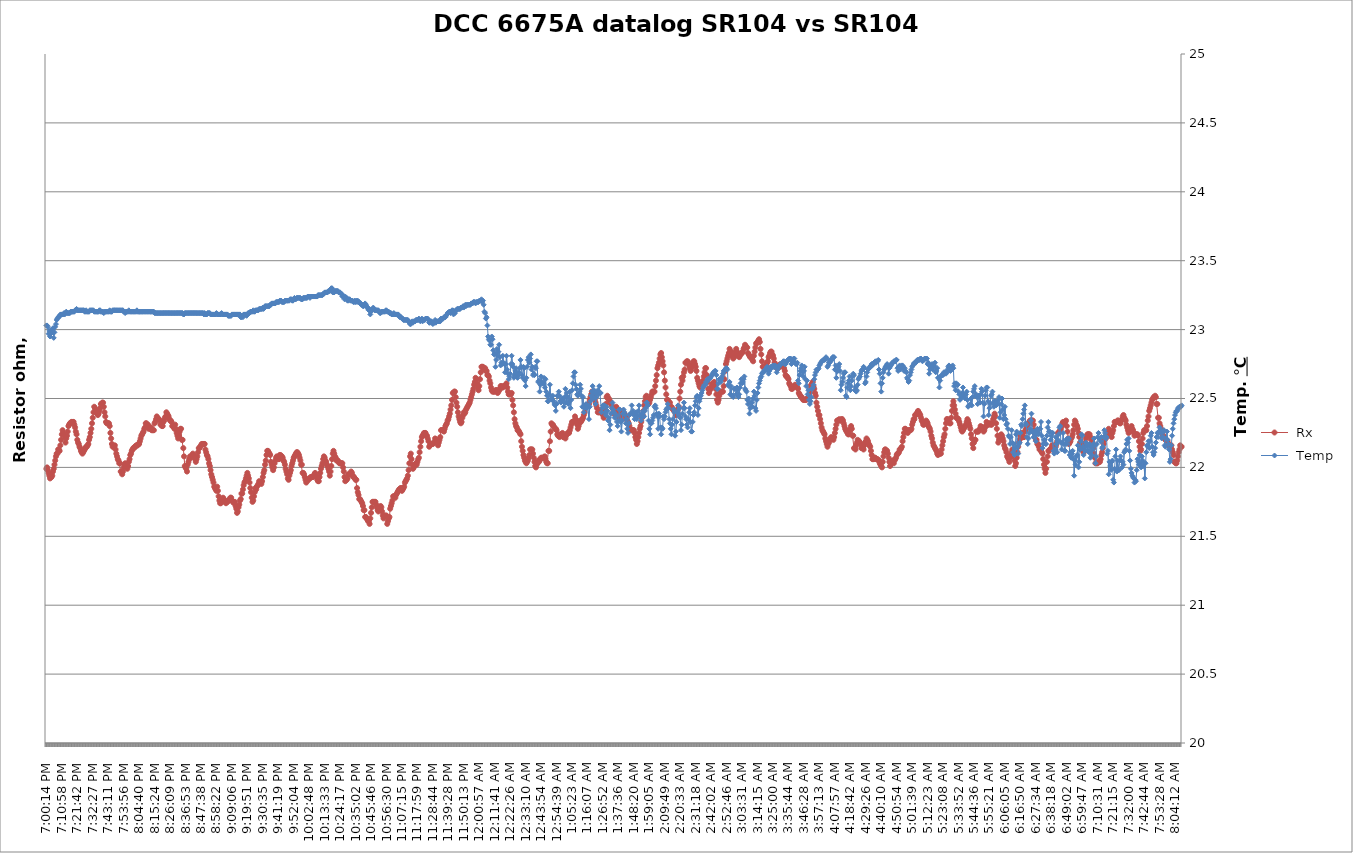
| Category |  Rx |
|---|---|
| 2021-03-25 19:00:14 | 10000.01 |
| 2021-03-25 19:00:44 | 10000.01 |
| 2021-03-25 19:01:15 | 10000.01 |
| 2021-03-25 19:01:46 | 10000.01 |
| 2021-03-25 19:02:16 | 10000.01 |
| 2021-03-25 19:02:47 | 10000.01 |
| 2021-03-25 19:03:18 | 10000.01 |
| 2021-03-25 19:03:49 | 10000.01 |
| 2021-03-25 19:04:19 | 10000.01 |
| 2021-03-25 19:04:50 | 10000.01 |
| 2021-03-25 19:05:21 | 10000.01 |
| 2021-03-25 19:05:51 | 10000.01 |
| 2021-03-25 19:06:22 | 10000.01 |
| 2021-03-25 19:06:53 | 10000.01 |
| 2021-03-25 19:07:23 | 10000.01 |
| 2021-03-25 19:07:54 | 10000.01 |
| 2021-03-25 19:08:25 | 10000.01 |
| 2021-03-25 19:08:55 | 10000.01 |
| 2021-03-25 19:09:26 | 10000.01 |
| 2021-03-25 19:09:57 | 10000.01 |
| 2021-03-25 19:10:27 | 10000.01 |
| 2021-03-25 19:10:58 | 10000.01 |
| 2021-03-25 19:11:29 | 10000.01 |
| 2021-03-25 19:11:59 | 10000.01 |
| 2021-03-25 19:12:30 | 10000.01 |
| 2021-03-25 19:13:01 | 10000.01 |
| 2021-03-25 19:13:32 | 10000.01 |
| 2021-03-25 19:14:02 | 10000.01 |
| 2021-03-25 19:14:33 | 10000.01 |
| 2021-03-25 19:15:04 | 10000.01 |
| 2021-03-25 19:15:34 | 10000.01 |
| 2021-03-25 19:16:05 | 10000.01 |
| 2021-03-25 19:16:36 | 10000.01 |
| 2021-03-25 19:17:06 | 10000.01 |
| 2021-03-25 19:17:37 | 10000.01 |
| 2021-03-25 19:18:08 | 10000.01 |
| 2021-03-25 19:18:38 | 10000.01 |
| 2021-03-25 19:19:09 | 10000.01 |
| 2021-03-25 19:19:40 | 10000.01 |
| 2021-03-25 19:20:10 | 10000.01 |
| 2021-03-25 19:20:41 | 10000.01 |
| 2021-03-25 19:21:12 | 10000.01 |
| 2021-03-25 19:21:42 | 10000.01 |
| 2021-03-25 19:22:13 | 10000.01 |
| 2021-03-25 19:22:44 | 10000.01 |
| 2021-03-25 19:23:15 | 10000.01 |
| 2021-03-25 19:23:45 | 10000.01 |
| 2021-03-25 19:24:16 | 10000.01 |
| 2021-03-25 19:24:47 | 10000.01 |
| 2021-03-25 19:25:17 | 10000.01 |
| 2021-03-25 19:25:48 | 10000.01 |
| 2021-03-25 19:26:19 | 10000.01 |
| 2021-03-25 19:26:49 | 10000.01 |
| 2021-03-25 19:27:20 | 10000.01 |
| 2021-03-25 19:27:51 | 10000.01 |
| 2021-03-25 19:28:21 | 10000.01 |
| 2021-03-25 19:28:52 | 10000.01 |
| 2021-03-25 19:29:23 | 10000.01 |
| 2021-03-25 19:29:53 | 10000.01 |
| 2021-03-25 19:30:24 | 10000.01 |
| 2021-03-25 19:30:55 | 10000.01 |
| 2021-03-25 19:31:25 | 10000.01 |
| 2021-03-25 19:31:56 | 10000.01 |
| 2021-03-25 19:32:27 | 10000.01 |
| 2021-03-25 19:32:58 | 10000.01 |
| 2021-03-25 19:33:28 | 10000.01 |
| 2021-03-25 19:33:59 | 10000.01 |
| 2021-03-25 19:34:30 | 10000.01 |
| 2021-03-25 19:35:00 | 10000.01 |
| 2021-03-25 19:35:31 | 10000.01 |
| 2021-03-25 19:36:02 | 10000.01 |
| 2021-03-25 19:36:32 | 10000.01 |
| 2021-03-25 19:37:03 | 10000.01 |
| 2021-03-25 19:37:34 | 10000.01 |
| 2021-03-25 19:38:04 | 10000.01 |
| 2021-03-25 19:38:35 | 10000.01 |
| 2021-03-25 19:39:06 | 10000.01 |
| 2021-03-25 19:39:36 | 10000.01 |
| 2021-03-25 19:40:07 | 10000.01 |
| 2021-03-25 19:40:38 | 10000.01 |
| 2021-03-25 19:41:09 | 10000.01 |
| 2021-03-25 19:41:39 | 10000.01 |
| 2021-03-25 19:42:10 | 10000.01 |
| 2021-03-25 19:42:41 | 10000.01 |
| 2021-03-25 19:43:11 | 10000.01 |
| 2021-03-25 19:43:42 | 10000.01 |
| 2021-03-25 19:44:13 | 10000.01 |
| 2021-03-25 19:44:43 | 10000.01 |
| 2021-03-25 19:45:14 | 10000.01 |
| 2021-03-25 19:45:45 | 10000.01 |
| 2021-03-25 19:46:15 | 10000.01 |
| 2021-03-25 19:46:46 | 10000.01 |
| 2021-03-25 19:47:17 | 10000.01 |
| 2021-03-25 19:47:47 | 10000.01 |
| 2021-03-25 19:48:18 | 10000.01 |
| 2021-03-25 19:48:49 | 10000.01 |
| 2021-03-25 19:49:19 | 10000.01 |
| 2021-03-25 19:49:50 | 10000.01 |
| 2021-03-25 19:50:21 | 10000.01 |
| 2021-03-25 19:50:52 | 10000.01 |
| 2021-03-25 19:51:22 | 10000.01 |
| 2021-03-25 19:51:53 | 10000.01 |
| 2021-03-25 19:52:24 | 10000.01 |
| 2021-03-25 19:52:54 | 10000.01 |
| 2021-03-25 19:53:25 | 10000.01 |
| 2021-03-25 19:53:56 | 10000.01 |
| 2021-03-25 19:54:26 | 10000.01 |
| 2021-03-25 19:54:57 | 10000.01 |
| 2021-03-25 19:55:28 | 10000.01 |
| 2021-03-25 19:55:58 | 10000.01 |
| 2021-03-25 19:56:29 | 10000.01 |
| 2021-03-25 19:57:00 | 10000.01 |
| 2021-03-25 19:57:30 | 10000.01 |
| 2021-03-25 19:58:01 | 10000.01 |
| 2021-03-25 19:58:32 | 10000.01 |
| 2021-03-25 19:59:03 | 10000.01 |
| 2021-03-25 19:59:33 | 10000.01 |
| 2021-03-25 20:00:04 | 10000.01 |
| 2021-03-25 20:00:35 | 10000.01 |
| 2021-03-25 20:01:05 | 10000.01 |
| 2021-03-25 20:01:36 | 10000.01 |
| 2021-03-25 20:02:07 | 10000.01 |
| 2021-03-25 20:02:37 | 10000.01 |
| 2021-03-25 20:03:08 | 10000.01 |
| 2021-03-25 20:03:39 | 10000.01 |
| 2021-03-25 20:04:09 | 10000.01 |
| 2021-03-25 20:04:40 | 10000.01 |
| 2021-03-25 20:05:11 | 10000.01 |
| 2021-03-25 20:05:41 | 10000.01 |
| 2021-03-25 20:06:12 | 10000.01 |
| 2021-03-25 20:06:43 | 10000.01 |
| 2021-03-25 20:07:13 | 10000.01 |
| 2021-03-25 20:07:44 | 10000.01 |
| 2021-03-25 20:08:15 | 10000.01 |
| 2021-03-25 20:08:46 | 10000.01 |
| 2021-03-25 20:09:16 | 10000.01 |
| 2021-03-25 20:09:47 | 10000.01 |
| 2021-03-25 20:10:18 | 10000.01 |
| 2021-03-25 20:10:48 | 10000.01 |
| 2021-03-25 20:11:19 | 10000.01 |
| 2021-03-25 20:11:50 | 10000.01 |
| 2021-03-25 20:12:20 | 10000.01 |
| 2021-03-25 20:12:51 | 10000.01 |
| 2021-03-25 20:13:22 | 10000.01 |
| 2021-03-25 20:13:52 | 10000.01 |
| 2021-03-25 20:14:23 | 10000.01 |
| 2021-03-25 20:14:54 | 10000.01 |
| 2021-03-25 20:15:24 | 10000.01 |
| 2021-03-25 20:15:55 | 10000.01 |
| 2021-03-25 20:16:26 | 10000.01 |
| 2021-03-25 20:16:56 | 10000.01 |
| 2021-03-25 20:17:27 | 10000.01 |
| 2021-03-25 20:17:58 | 10000.01 |
| 2021-03-25 20:18:29 | 10000.01 |
| 2021-03-25 20:18:59 | 10000.01 |
| 2021-03-25 20:19:30 | 10000.01 |
| 2021-03-25 20:20:01 | 10000.01 |
| 2021-03-25 20:20:31 | 10000.01 |
| 2021-03-25 20:21:02 | 10000.01 |
| 2021-03-25 20:21:33 | 10000.01 |
| 2021-03-25 20:22:03 | 10000.01 |
| 2021-03-25 20:22:34 | 10000.01 |
| 2021-03-25 20:23:05 | 10000.01 |
| 2021-03-25 20:23:35 | 10000.01 |
| 2021-03-25 20:24:06 | 10000.01 |
| 2021-03-25 20:24:37 | 10000.01 |
| 2021-03-25 20:25:07 | 10000.01 |
| 2021-03-25 20:25:38 | 10000.01 |
| 2021-03-25 20:26:09 | 10000.01 |
| 2021-03-25 20:26:40 | 10000.01 |
| 2021-03-25 20:27:10 | 10000.01 |
| 2021-03-25 20:27:41 | 10000.01 |
| 2021-03-25 20:28:12 | 10000.01 |
| 2021-03-25 20:28:42 | 10000.01 |
| 2021-03-25 20:29:13 | 10000.01 |
| 2021-03-25 20:29:44 | 10000.01 |
| 2021-03-25 20:30:14 | 10000.01 |
| 2021-03-25 20:30:45 | 10000.01 |
| 2021-03-25 20:31:16 | 10000.01 |
| 2021-03-25 20:31:46 | 10000.01 |
| 2021-03-25 20:32:17 | 10000.01 |
| 2021-03-25 20:32:48 | 10000.01 |
| 2021-03-25 20:33:18 | 10000.01 |
| 2021-03-25 20:33:49 | 10000.01 |
| 2021-03-25 20:34:20 | 10000.01 |
| 2021-03-25 20:34:50 | 10000.01 |
| 2021-03-25 20:35:21 | 10000.01 |
| 2021-03-25 20:35:52 | 10000.01 |
| 2021-03-25 20:36:23 | 10000.01 |
| 2021-03-25 20:36:53 | 10000.01 |
| 2021-03-25 20:37:24 | 10000.01 |
| 2021-03-25 20:37:55 | 10000.01 |
| 2021-03-25 20:38:25 | 10000.01 |
| 2021-03-25 20:38:56 | 10000.01 |
| 2021-03-25 20:39:27 | 10000.01 |
| 2021-03-25 20:39:57 | 10000.01 |
| 2021-03-25 20:40:28 | 10000.01 |
| 2021-03-25 20:40:59 | 10000.01 |
| 2021-03-25 20:41:29 | 10000.01 |
| 2021-03-25 20:42:00 | 10000.01 |
| 2021-03-25 20:42:31 | 10000.01 |
| 2021-03-25 20:43:01 | 10000.01 |
| 2021-03-25 20:43:32 | 10000.01 |
| 2021-03-25 20:44:03 | 10000.01 |
| 2021-03-25 20:44:33 | 10000.01 |
| 2021-03-25 20:45:04 | 10000.01 |
| 2021-03-25 20:45:35 | 10000.01 |
| 2021-03-25 20:46:06 | 10000.01 |
| 2021-03-25 20:46:36 | 10000.01 |
| 2021-03-25 20:47:07 | 10000.01 |
| 2021-03-25 20:47:38 | 10000.01 |
| 2021-03-25 20:48:08 | 10000.01 |
| 2021-03-25 20:48:39 | 10000.01 |
| 2021-03-25 20:49:10 | 10000.01 |
| 2021-03-25 20:49:40 | 10000.01 |
| 2021-03-25 20:50:11 | 10000.01 |
| 2021-03-25 20:50:42 | 10000.01 |
| 2021-03-25 20:51:12 | 10000.01 |
| 2021-03-25 20:51:43 | 10000.01 |
| 2021-03-25 20:52:14 | 10000.01 |
| 2021-03-25 20:52:44 | 10000.01 |
| 2021-03-25 20:53:15 | 10000.01 |
| 2021-03-25 20:53:46 | 10000.01 |
| 2021-03-25 20:54:17 | 10000.01 |
| 2021-03-25 20:54:47 | 10000.01 |
| 2021-03-25 20:55:18 | 10000.01 |
| 2021-03-25 20:55:49 | 10000.01 |
| 2021-03-25 20:56:19 | 10000.01 |
| 2021-03-25 20:56:50 | 10000.01 |
| 2021-03-25 20:57:21 | 10000.01 |
| 2021-03-25 20:57:51 | 10000.01 |
| 2021-03-25 20:58:22 | 10000.01 |
| 2021-03-25 20:58:53 | 10000.01 |
| 2021-03-25 20:59:23 | 10000.01 |
| 2021-03-25 20:59:54 | 10000.01 |
| 2021-03-25 21:00:25 | 10000.01 |
| 2021-03-25 21:00:55 | 10000.01 |
| 2021-03-25 21:01:26 | 10000.01 |
| 2021-03-25 21:01:57 | 10000.01 |
| 2021-03-25 21:02:27 | 10000.01 |
| 2021-03-25 21:02:58 | 10000.01 |
| 2021-03-25 21:03:29 | 10000.01 |
| 2021-03-25 21:03:59 | 10000.01 |
| 2021-03-25 21:04:30 | 10000.01 |
| 2021-03-25 21:05:01 | 10000.01 |
| 2021-03-25 21:05:32 | 10000.01 |
| 2021-03-25 21:06:02 | 10000.01 |
| 2021-03-25 21:06:33 | 10000.01 |
| 2021-03-25 21:07:04 | 10000.01 |
| 2021-03-25 21:07:34 | 10000.01 |
| 2021-03-25 21:08:05 | 10000.01 |
| 2021-03-25 21:08:36 | 10000.01 |
| 2021-03-25 21:09:06 | 10000.01 |
| 2021-03-25 21:09:37 | 10000.01 |
| 2021-03-25 21:10:08 | 10000.01 |
| 2021-03-25 21:10:38 | 10000.01 |
| 2021-03-25 21:11:09 | 10000.01 |
| 2021-03-25 21:11:40 | 10000.01 |
| 2021-03-25 21:12:10 | 10000.01 |
| 2021-03-25 21:12:41 | 10000.01 |
| 2021-03-25 21:13:12 | 10000.01 |
| 2021-03-25 21:13:42 | 10000.01 |
| 2021-03-25 21:14:13 | 10000.01 |
| 2021-03-25 21:14:44 | 10000.01 |
| 2021-03-25 21:15:15 | 10000.01 |
| 2021-03-25 21:15:45 | 10000.01 |
| 2021-03-25 21:16:16 | 10000.01 |
| 2021-03-25 21:16:47 | 10000.01 |
| 2021-03-25 21:17:17 | 10000.01 |
| 2021-03-25 21:17:48 | 10000.01 |
| 2021-03-25 21:18:19 | 10000.01 |
| 2021-03-25 21:18:49 | 10000.01 |
| 2021-03-25 21:19:20 | 10000.01 |
| 2021-03-25 21:19:51 | 10000.01 |
| 2021-03-25 21:20:21 | 10000.01 |
| 2021-03-25 21:20:52 | 10000.01 |
| 2021-03-25 21:21:23 | 10000.01 |
| 2021-03-25 21:21:53 | 10000.01 |
| 2021-03-25 21:22:24 | 10000.01 |
| 2021-03-25 21:22:55 | 10000.01 |
| 2021-03-25 21:23:25 | 10000.01 |
| 2021-03-25 21:23:56 | 10000.01 |
| 2021-03-25 21:24:27 | 10000.01 |
| 2021-03-25 21:24:58 | 10000.01 |
| 2021-03-25 21:25:28 | 10000.01 |
| 2021-03-25 21:25:59 | 10000.01 |
| 2021-03-25 21:26:30 | 10000.01 |
| 2021-03-25 21:27:00 | 10000.01 |
| 2021-03-25 21:27:31 | 10000.01 |
| 2021-03-25 21:28:02 | 10000.01 |
| 2021-03-25 21:28:32 | 10000.01 |
| 2021-03-25 21:29:03 | 10000.01 |
| 2021-03-25 21:29:34 | 10000.01 |
| 2021-03-25 21:30:04 | 10000.01 |
| 2021-03-25 21:30:35 | 10000.01 |
| 2021-03-25 21:31:06 | 10000.01 |
| 2021-03-25 21:31:36 | 10000.01 |
| 2021-03-25 21:32:07 | 10000.01 |
| 2021-03-25 21:32:38 | 10000.01 |
| 2021-03-25 21:33:08 | 10000.01 |
| 2021-03-25 21:33:39 | 10000.01 |
| 2021-03-25 21:34:10 | 10000.01 |
| 2021-03-25 21:34:41 | 10000.01 |
| 2021-03-25 21:35:11 | 10000.01 |
| 2021-03-25 21:35:42 | 10000.01 |
| 2021-03-25 21:36:13 | 10000.01 |
| 2021-03-25 21:36:43 | 10000.01 |
| 2021-03-25 21:37:14 | 10000.01 |
| 2021-03-25 21:37:45 | 10000.01 |
| 2021-03-25 21:38:15 | 10000.01 |
| 2021-03-25 21:38:46 | 10000.01 |
| 2021-03-25 21:39:17 | 10000.01 |
| 2021-03-25 21:39:47 | 10000.01 |
| 2021-03-25 21:40:18 | 10000.01 |
| 2021-03-25 21:40:49 | 10000.01 |
| 2021-03-25 21:41:19 | 10000.01 |
| 2021-03-25 21:41:50 | 10000.01 |
| 2021-03-25 21:42:21 | 10000.01 |
| 2021-03-25 21:42:51 | 10000.01 |
| 2021-03-25 21:43:22 | 10000.01 |
| 2021-03-25 21:43:53 | 10000.01 |
| 2021-03-25 21:44:24 | 10000.01 |
| 2021-03-25 21:44:54 | 10000.01 |
| 2021-03-25 21:45:25 | 10000.01 |
| 2021-03-25 21:45:56 | 10000.01 |
| 2021-03-25 21:46:26 | 10000.01 |
| 2021-03-25 21:46:57 | 10000.01 |
| 2021-03-25 21:47:28 | 10000.01 |
| 2021-03-25 21:47:58 | 10000.01 |
| 2021-03-25 21:48:29 | 10000.01 |
| 2021-03-25 21:49:00 | 10000.01 |
| 2021-03-25 21:49:30 | 10000.01 |
| 2021-03-25 21:50:01 | 10000.01 |
| 2021-03-25 21:50:32 | 10000.01 |
| 2021-03-25 21:51:02 | 10000.01 |
| 2021-03-25 21:51:33 | 10000.01 |
| 2021-03-25 21:52:04 | 10000.01 |
| 2021-03-25 21:52:35 | 10000.01 |
| 2021-03-25 21:53:05 | 10000.01 |
| 2021-03-25 21:53:36 | 10000.01 |
| 2021-03-25 21:54:07 | 10000.01 |
| 2021-03-25 21:54:37 | 10000.01 |
| 2021-03-25 21:55:08 | 10000.01 |
| 2021-03-25 21:55:39 | 10000.01 |
| 2021-03-25 21:56:09 | 10000.01 |
| 2021-03-25 21:56:40 | 10000.01 |
| 2021-03-25 21:57:11 | 10000.01 |
| 2021-03-25 21:57:41 | 10000.01 |
| 2021-03-25 21:58:12 | 10000.01 |
| 2021-03-25 21:58:43 | 10000.01 |
| 2021-03-25 21:59:13 | 10000.01 |
| 2021-03-25 21:59:44 | 10000.01 |
| 2021-03-25 22:00:15 | 10000.01 |
| 2021-03-25 22:00:46 | 10000.01 |
| 2021-03-25 22:01:16 | 10000.01 |
| 2021-03-25 22:01:47 | 10000.01 |
| 2021-03-25 22:02:18 | 10000.01 |
| 2021-03-25 22:02:48 | 10000.01 |
| 2021-03-25 22:03:19 | 10000.01 |
| 2021-03-25 22:03:50 | 10000.01 |
| 2021-03-25 22:04:20 | 10000.01 |
| 2021-03-25 22:04:51 | 10000.01 |
| 2021-03-25 22:05:22 | 10000.01 |
| 2021-03-25 22:05:52 | 10000.01 |
| 2021-03-25 22:06:23 | 10000.01 |
| 2021-03-25 22:06:54 | 10000.01 |
| 2021-03-25 22:07:24 | 10000.01 |
| 2021-03-25 22:07:55 | 10000.01 |
| 2021-03-25 22:08:26 | 10000.01 |
| 2021-03-25 22:08:56 | 10000.01 |
| 2021-03-25 22:09:27 | 10000.01 |
| 2021-03-25 22:09:58 | 10000.01 |
| 2021-03-25 22:10:29 | 10000.01 |
| 2021-03-25 22:10:59 | 10000.01 |
| 2021-03-25 22:11:30 | 10000.01 |
| 2021-03-25 22:12:01 | 10000.01 |
| 2021-03-25 22:12:31 | 10000.01 |
| 2021-03-25 22:13:02 | 10000.01 |
| 2021-03-25 22:13:33 | 10000.01 |
| 2021-03-25 22:14:03 | 10000.01 |
| 2021-03-25 22:14:34 | 10000.01 |
| 2021-03-25 22:15:05 | 10000.01 |
| 2021-03-25 22:15:35 | 10000.01 |
| 2021-03-25 22:16:06 | 10000.01 |
| 2021-03-25 22:16:37 | 10000.01 |
| 2021-03-25 22:17:07 | 10000.01 |
| 2021-03-25 22:17:38 | 10000.01 |
| 2021-03-25 22:18:09 | 10000.01 |
| 2021-03-25 22:18:40 | 10000.01 |
| 2021-03-25 22:19:10 | 10000.01 |
| 2021-03-25 22:19:41 | 10000.01 |
| 2021-03-25 22:20:12 | 10000.01 |
| 2021-03-25 22:20:42 | 10000.01 |
| 2021-03-25 22:21:13 | 10000.01 |
| 2021-03-25 22:21:44 | 10000.01 |
| 2021-03-25 22:22:14 | 10000.01 |
| 2021-03-25 22:22:45 | 10000.01 |
| 2021-03-25 22:23:16 | 10000.01 |
| 2021-03-25 22:23:46 | 10000.01 |
| 2021-03-25 22:24:17 | 10000.01 |
| 2021-03-25 22:24:48 | 10000.01 |
| 2021-03-25 22:25:18 | 10000.01 |
| 2021-03-25 22:25:49 | 10000.01 |
| 2021-03-25 22:26:20 | 10000.01 |
| 2021-03-25 22:26:51 | 10000.01 |
| 2021-03-25 22:27:21 | 10000.01 |
| 2021-03-25 22:27:52 | 10000.01 |
| 2021-03-25 22:28:23 | 10000.01 |
| 2021-03-25 22:28:53 | 10000.01 |
| 2021-03-25 22:29:24 | 10000.01 |
| 2021-03-25 22:29:55 | 10000.01 |
| 2021-03-25 22:30:25 | 10000.01 |
| 2021-03-25 22:30:56 | 10000.01 |
| 2021-03-25 22:31:27 | 10000.01 |
| 2021-03-25 22:31:57 | 10000.01 |
| 2021-03-25 22:32:28 | 10000.01 |
| 2021-03-25 22:32:59 | 10000.01 |
| 2021-03-25 22:33:29 | 10000.01 |
| 2021-03-25 22:34:00 | 10000.01 |
| 2021-03-25 22:34:31 | 10000.01 |
| 2021-03-25 22:35:02 | 10000.01 |
| 2021-03-25 22:35:32 | 10000.01 |
| 2021-03-25 22:36:03 | 10000.01 |
| 2021-03-25 22:36:34 | 10000.01 |
| 2021-03-25 22:37:04 | 10000.01 |
| 2021-03-25 22:37:35 | 10000.01 |
| 2021-03-25 22:38:06 | 10000.01 |
| 2021-03-25 22:38:36 | 10000.01 |
| 2021-03-25 22:39:07 | 10000.01 |
| 2021-03-25 22:39:38 | 10000.01 |
| 2021-03-25 22:40:08 | 10000.01 |
| 2021-03-25 22:40:39 | 10000.01 |
| 2021-03-25 22:41:10 | 10000.01 |
| 2021-03-25 22:41:40 | 10000.01 |
| 2021-03-25 22:42:11 | 10000.01 |
| 2021-03-25 22:42:42 | 10000.01 |
| 2021-03-25 22:43:13 | 10000.01 |
| 2021-03-25 22:43:43 | 10000.01 |
| 2021-03-25 22:44:14 | 10000.01 |
| 2021-03-25 22:44:45 | 10000.01 |
| 2021-03-25 22:45:15 | 10000.01 |
| 2021-03-25 22:45:46 | 10000.01 |
| 2021-03-25 22:46:17 | 10000.01 |
| 2021-03-25 22:46:47 | 10000.01 |
| 2021-03-25 22:47:18 | 10000.01 |
| 2021-03-25 22:47:49 | 10000.01 |
| 2021-03-25 22:48:19 | 10000.01 |
| 2021-03-25 22:48:50 | 10000.01 |
| 2021-03-25 22:49:21 | 10000.01 |
| 2021-03-25 22:49:51 | 10000.01 |
| 2021-03-25 22:50:22 | 10000.01 |
| 2021-03-25 22:50:53 | 10000.01 |
| 2021-03-25 22:51:24 | 10000.01 |
| 2021-03-25 22:51:54 | 10000.01 |
| 2021-03-25 22:52:25 | 10000.01 |
| 2021-03-25 22:52:56 | 10000.01 |
| 2021-03-25 22:53:26 | 10000.01 |
| 2021-03-25 22:53:57 | 10000.01 |
| 2021-03-25 22:54:28 | 10000.01 |
| 2021-03-25 22:54:58 | 10000.01 |
| 2021-03-25 22:55:29 | 10000.01 |
| 2021-03-25 22:56:00 | 10000.01 |
| 2021-03-25 22:56:30 | 10000.01 |
| 2021-03-25 22:57:01 | 10000.01 |
| 2021-03-25 22:57:32 | 10000.01 |
| 2021-03-25 22:58:02 | 10000.01 |
| 2021-03-25 22:58:33 | 10000.01 |
| 2021-03-25 22:59:04 | 10000.01 |
| 2021-03-25 22:59:34 | 10000.01 |
| 2021-03-25 23:00:05 | 10000.01 |
| 2021-03-25 23:00:36 | 10000.01 |
| 2021-03-25 23:01:07 | 10000.01 |
| 2021-03-25 23:01:37 | 10000.01 |
| 2021-03-25 23:02:08 | 10000.01 |
| 2021-03-25 23:02:39 | 10000.01 |
| 2021-03-25 23:03:09 | 10000.01 |
| 2021-03-25 23:03:40 | 10000.01 |
| 2021-03-25 23:04:11 | 10000.01 |
| 2021-03-25 23:04:41 | 10000.01 |
| 2021-03-25 23:05:12 | 10000.01 |
| 2021-03-25 23:05:43 | 10000.01 |
| 2021-03-25 23:06:13 | 10000.01 |
| 2021-03-25 23:06:44 | 10000.01 |
| 2021-03-25 23:07:15 | 10000.01 |
| 2021-03-25 23:07:46 | 10000.01 |
| 2021-03-25 23:08:16 | 10000.01 |
| 2021-03-25 23:08:47 | 10000.01 |
| 2021-03-25 23:09:18 | 10000.01 |
| 2021-03-25 23:09:48 | 10000.01 |
| 2021-03-25 23:10:19 | 10000.01 |
| 2021-03-25 23:10:50 | 10000.01 |
| 2021-03-25 23:11:20 | 10000.01 |
| 2021-03-25 23:11:51 | 10000.01 |
| 2021-03-25 23:12:22 | 10000.01 |
| 2021-03-25 23:12:52 | 10000.01 |
| 2021-03-25 23:13:23 | 10000.01 |
| 2021-03-25 23:13:54 | 10000.01 |
| 2021-03-25 23:14:24 | 10000.01 |
| 2021-03-25 23:14:55 | 10000.01 |
| 2021-03-25 23:15:26 | 10000.01 |
| 2021-03-25 23:15:57 | 10000.01 |
| 2021-03-25 23:16:27 | 10000.01 |
| 2021-03-25 23:16:58 | 10000.01 |
| 2021-03-25 23:17:29 | 10000.01 |
| 2021-03-25 23:17:59 | 10000.01 |
| 2021-03-25 23:18:30 | 10000.01 |
| 2021-03-25 23:19:01 | 10000.01 |
| 2021-03-25 23:19:31 | 10000.01 |
| 2021-03-25 23:20:02 | 10000.01 |
| 2021-03-25 23:20:33 | 10000.01 |
| 2021-03-25 23:21:03 | 10000.01 |
| 2021-03-25 23:21:34 | 10000.01 |
| 2021-03-25 23:22:05 | 10000.01 |
| 2021-03-25 23:22:35 | 10000.01 |
| 2021-03-25 23:23:06 | 10000.01 |
| 2021-03-25 23:23:37 | 10000.01 |
| 2021-03-25 23:24:08 | 10000.01 |
| 2021-03-25 23:24:38 | 10000.01 |
| 2021-03-25 23:25:09 | 10000.01 |
| 2021-03-25 23:25:40 | 10000.01 |
| 2021-03-25 23:26:10 | 10000.01 |
| 2021-03-25 23:26:41 | 10000.01 |
| 2021-03-25 23:27:12 | 10000.01 |
| 2021-03-25 23:27:42 | 10000.01 |
| 2021-03-25 23:28:13 | 10000.01 |
| 2021-03-25 23:28:44 | 10000.01 |
| 2021-03-25 23:29:14 | 10000.01 |
| 2021-03-25 23:29:45 | 10000.01 |
| 2021-03-25 23:30:16 | 10000.01 |
| 2021-03-25 23:30:46 | 10000.01 |
| 2021-03-25 23:31:17 | 10000.01 |
| 2021-03-25 23:31:48 | 10000.01 |
| 2021-03-25 23:32:19 | 10000.01 |
| 2021-03-25 23:32:49 | 10000.01 |
| 2021-03-25 23:33:20 | 10000.01 |
| 2021-03-25 23:33:51 | 10000.01 |
| 2021-03-25 23:34:21 | 10000.01 |
| 2021-03-25 23:34:52 | 10000.01 |
| 2021-03-25 23:35:23 | 10000.01 |
| 2021-03-25 23:35:53 | 10000.01 |
| 2021-03-25 23:36:24 | 10000.01 |
| 2021-03-25 23:36:55 | 10000.01 |
| 2021-03-25 23:37:25 | 10000.01 |
| 2021-03-25 23:37:56 | 10000.01 |
| 2021-03-25 23:38:27 | 10000.01 |
| 2021-03-25 23:38:57 | 10000.01 |
| 2021-03-25 23:39:28 | 10000.01 |
| 2021-03-25 23:39:59 | 10000.01 |
| 2021-03-25 23:40:29 | 10000.01 |
| 2021-03-25 23:41:00 | 10000.01 |
| 2021-03-25 23:41:31 | 10000.01 |
| 2021-03-25 23:42:02 | 10000.01 |
| 2021-03-25 23:42:32 | 10000.011 |
| 2021-03-25 23:43:03 | 10000.011 |
| 2021-03-25 23:43:34 | 10000.011 |
| 2021-03-25 23:44:04 | 10000.011 |
| 2021-03-25 23:44:35 | 10000.011 |
| 2021-03-25 23:45:06 | 10000.01 |
| 2021-03-25 23:45:36 | 10000.01 |
| 2021-03-25 23:46:07 | 10000.01 |
| 2021-03-25 23:46:38 | 10000.01 |
| 2021-03-25 23:47:08 | 10000.01 |
| 2021-03-25 23:47:39 | 10000.01 |
| 2021-03-25 23:48:10 | 10000.01 |
| 2021-03-25 23:48:40 | 10000.01 |
| 2021-03-25 23:49:11 | 10000.01 |
| 2021-03-25 23:49:42 | 10000.01 |
| 2021-03-25 23:50:13 | 10000.01 |
| 2021-03-25 23:50:43 | 10000.01 |
| 2021-03-25 23:51:14 | 10000.01 |
| 2021-03-25 23:51:45 | 10000.01 |
| 2021-03-25 23:52:15 | 10000.01 |
| 2021-03-25 23:52:46 | 10000.01 |
| 2021-03-25 23:53:17 | 10000.01 |
| 2021-03-25 23:53:47 | 10000.01 |
| 2021-03-25 23:54:18 | 10000.01 |
| 2021-03-25 23:54:49 | 10000.01 |
| 2021-03-25 23:55:19 | 10000.011 |
| 2021-03-25 23:55:50 | 10000.011 |
| 2021-03-25 23:56:21 | 10000.011 |
| 2021-03-25 23:56:51 | 10000.011 |
| 2021-03-25 23:57:22 | 10000.011 |
| 2021-03-25 23:57:53 | 10000.011 |
| 2021-03-25 23:58:24 | 10000.011 |
| 2021-03-25 23:58:54 | 10000.011 |
| 2021-03-25 23:59:25 | 10000.011 |
| 2021-03-25 23:59:56 | 10000.011 |
| 2021-03-26 00:00:26 | 10000.011 |
| 2021-03-26 00:00:57 | 10000.011 |
| 2021-03-26 00:01:28 | 10000.011 |
| 2021-03-26 00:01:58 | 10000.011 |
| 2021-03-26 00:02:29 | 10000.011 |
| 2021-03-26 00:03:00 | 10000.011 |
| 2021-03-26 00:03:30 | 10000.011 |
| 2021-03-26 00:04:01 | 10000.011 |
| 2021-03-26 00:04:32 | 10000.011 |
| 2021-03-26 00:05:02 | 10000.011 |
| 2021-03-26 00:05:33 | 10000.011 |
| 2021-03-26 00:06:04 | 10000.011 |
| 2021-03-26 00:06:35 | 10000.011 |
| 2021-03-26 00:07:05 | 10000.011 |
| 2021-03-26 00:07:36 | 10000.011 |
| 2021-03-26 00:08:07 | 10000.011 |
| 2021-03-26 00:08:37 | 10000.011 |
| 2021-03-26 00:09:08 | 10000.011 |
| 2021-03-26 00:09:39 | 10000.011 |
| 2021-03-26 00:10:09 | 10000.011 |
| 2021-03-26 00:10:40 | 10000.011 |
| 2021-03-26 00:11:11 | 10000.011 |
| 2021-03-26 00:11:41 | 10000.011 |
| 2021-03-26 00:12:12 | 10000.011 |
| 2021-03-26 00:12:43 | 10000.011 |
| 2021-03-26 00:13:13 | 10000.011 |
| 2021-03-26 00:13:44 | 10000.011 |
| 2021-03-26 00:14:15 | 10000.011 |
| 2021-03-26 00:14:46 | 10000.011 |
| 2021-03-26 00:15:16 | 10000.011 |
| 2021-03-26 00:15:47 | 10000.011 |
| 2021-03-26 00:16:18 | 10000.011 |
| 2021-03-26 00:16:48 | 10000.011 |
| 2021-03-26 00:17:19 | 10000.011 |
| 2021-03-26 00:17:50 | 10000.011 |
| 2021-03-26 00:18:20 | 10000.011 |
| 2021-03-26 00:18:51 | 10000.011 |
| 2021-03-26 00:19:22 | 10000.011 |
| 2021-03-26 00:19:52 | 10000.011 |
| 2021-03-26 00:20:23 | 10000.011 |
| 2021-03-26 00:20:54 | 10000.011 |
| 2021-03-26 00:21:24 | 10000.011 |
| 2021-03-26 00:21:55 | 10000.011 |
| 2021-03-26 00:22:26 | 10000.011 |
| 2021-03-26 00:22:56 | 10000.011 |
| 2021-03-26 00:23:27 | 10000.011 |
| 2021-03-26 00:23:58 | 10000.01 |
| 2021-03-26 00:24:29 | 10000.01 |
| 2021-03-26 00:24:59 | 10000.01 |
| 2021-03-26 00:25:30 | 10000.01 |
| 2021-03-26 00:26:01 | 10000.01 |
| 2021-03-26 00:26:31 | 10000.01 |
| 2021-03-26 00:27:02 | 10000.01 |
| 2021-03-26 00:27:33 | 10000.01 |
| 2021-03-26 00:28:03 | 10000.01 |
| 2021-03-26 00:28:34 | 10000.01 |
| 2021-03-26 00:29:05 | 10000.01 |
| 2021-03-26 00:29:35 | 10000.01 |
| 2021-03-26 00:30:06 | 10000.01 |
| 2021-03-26 00:30:37 | 10000.01 |
| 2021-03-26 00:31:07 | 10000.01 |
| 2021-03-26 00:31:38 | 10000.01 |
| 2021-03-26 00:32:09 | 10000.01 |
| 2021-03-26 00:32:39 | 10000.01 |
| 2021-03-26 00:33:10 | 10000.01 |
| 2021-03-26 00:33:41 | 10000.01 |
| 2021-03-26 00:34:11 | 10000.01 |
| 2021-03-26 00:34:42 | 10000.01 |
| 2021-03-26 00:35:13 | 10000.01 |
| 2021-03-26 00:35:44 | 10000.01 |
| 2021-03-26 00:36:14 | 10000.01 |
| 2021-03-26 00:36:45 | 10000.01 |
| 2021-03-26 00:37:16 | 10000.01 |
| 2021-03-26 00:37:46 | 10000.01 |
| 2021-03-26 00:38:17 | 10000.01 |
| 2021-03-26 00:38:48 | 10000.01 |
| 2021-03-26 00:39:18 | 10000.01 |
| 2021-03-26 00:39:49 | 10000.01 |
| 2021-03-26 00:40:20 | 10000.01 |
| 2021-03-26 00:40:50 | 10000.01 |
| 2021-03-26 00:41:21 | 10000.01 |
| 2021-03-26 00:41:52 | 10000.01 |
| 2021-03-26 00:42:22 | 10000.01 |
| 2021-03-26 00:42:53 | 10000.01 |
| 2021-03-26 00:43:24 | 10000.01 |
| 2021-03-26 00:43:54 | 10000.01 |
| 2021-03-26 00:44:25 | 10000.01 |
| 2021-03-26 00:44:56 | 10000.01 |
| 2021-03-26 00:45:27 | 10000.01 |
| 2021-03-26 00:45:57 | 10000.01 |
| 2021-03-26 00:46:28 | 10000.01 |
| 2021-03-26 00:46:59 | 10000.01 |
| 2021-03-26 00:47:29 | 10000.01 |
| 2021-03-26 00:48:00 | 10000.01 |
| 2021-03-26 00:48:31 | 10000.01 |
| 2021-03-26 00:49:01 | 10000.01 |
| 2021-03-26 00:49:32 | 10000.01 |
| 2021-03-26 00:50:03 | 10000.01 |
| 2021-03-26 00:50:33 | 10000.01 |
| 2021-03-26 00:51:04 | 10000.01 |
| 2021-03-26 00:51:35 | 10000.01 |
| 2021-03-26 00:52:05 | 10000.01 |
| 2021-03-26 00:52:36 | 10000.01 |
| 2021-03-26 00:53:07 | 10000.01 |
| 2021-03-26 00:53:37 | 10000.01 |
| 2021-03-26 00:54:08 | 10000.01 |
| 2021-03-26 00:54:39 | 10000.01 |
| 2021-03-26 00:55:10 | 10000.01 |
| 2021-03-26 00:55:40 | 10000.01 |
| 2021-03-26 00:56:11 | 10000.01 |
| 2021-03-26 00:56:42 | 10000.01 |
| 2021-03-26 00:57:12 | 10000.01 |
| 2021-03-26 00:57:43 | 10000.01 |
| 2021-03-26 00:58:14 | 10000.01 |
| 2021-03-26 00:58:44 | 10000.01 |
| 2021-03-26 00:59:15 | 10000.01 |
| 2021-03-26 00:59:46 | 10000.01 |
| 2021-03-26 01:00:16 | 10000.01 |
| 2021-03-26 01:00:47 | 10000.01 |
| 2021-03-26 01:01:18 | 10000.01 |
| 2021-03-26 01:01:48 | 10000.01 |
| 2021-03-26 01:02:19 | 10000.01 |
| 2021-03-26 01:02:50 | 10000.01 |
| 2021-03-26 01:03:20 | 10000.01 |
| 2021-03-26 01:03:51 | 10000.01 |
| 2021-03-26 01:04:22 | 10000.01 |
| 2021-03-26 01:04:52 | 10000.01 |
| 2021-03-26 01:05:23 | 10000.01 |
| 2021-03-26 01:05:54 | 10000.01 |
| 2021-03-26 01:06:25 | 10000.01 |
| 2021-03-26 01:06:55 | 10000.01 |
| 2021-03-26 01:07:26 | 10000.01 |
| 2021-03-26 01:07:57 | 10000.01 |
| 2021-03-26 01:08:27 | 10000.01 |
| 2021-03-26 01:08:58 | 10000.01 |
| 2021-03-26 01:09:29 | 10000.01 |
| 2021-03-26 01:09:59 | 10000.01 |
| 2021-03-26 01:10:30 | 10000.01 |
| 2021-03-26 01:11:01 | 10000.01 |
| 2021-03-26 01:11:31 | 10000.01 |
| 2021-03-26 01:12:02 | 10000.01 |
| 2021-03-26 01:12:33 | 10000.01 |
| 2021-03-26 01:13:03 | 10000.01 |
| 2021-03-26 01:13:34 | 10000.01 |
| 2021-03-26 01:14:05 | 10000.01 |
| 2021-03-26 01:14:35 | 10000.01 |
| 2021-03-26 01:15:06 | 10000.01 |
| 2021-03-26 01:15:37 | 10000.01 |
| 2021-03-26 01:16:07 | 10000.01 |
| 2021-03-26 01:16:38 | 10000.01 |
| 2021-03-26 01:17:09 | 10000.01 |
| 2021-03-26 01:17:39 | 10000.01 |
| 2021-03-26 01:18:10 | 10000.011 |
| 2021-03-26 01:18:41 | 10000.011 |
| 2021-03-26 01:19:12 | 10000.011 |
| 2021-03-26 01:19:42 | 10000.011 |
| 2021-03-26 01:20:13 | 10000.011 |
| 2021-03-26 01:20:44 | 10000.01 |
| 2021-03-26 01:21:14 | 10000.01 |
| 2021-03-26 01:21:45 | 10000.01 |
| 2021-03-26 01:22:16 | 10000.01 |
| 2021-03-26 01:22:46 | 10000.01 |
| 2021-03-26 01:23:17 | 10000.01 |
| 2021-03-26 01:23:48 | 10000.01 |
| 2021-03-26 01:24:18 | 10000.01 |
| 2021-03-26 01:24:49 | 10000.01 |
| 2021-03-26 01:25:20 | 10000.01 |
| 2021-03-26 01:25:50 | 10000.01 |
| 2021-03-26 01:26:21 | 10000.01 |
| 2021-03-26 01:26:52 | 10000.01 |
| 2021-03-26 01:27:22 | 10000.01 |
| 2021-03-26 01:27:53 | 10000.01 |
| 2021-03-26 01:28:24 | 10000.01 |
| 2021-03-26 01:28:54 | 10000.01 |
| 2021-03-26 01:29:25 | 10000.011 |
| 2021-03-26 01:29:56 | 10000.011 |
| 2021-03-26 01:30:27 | 10000.01 |
| 2021-03-26 01:30:57 | 10000.01 |
| 2021-03-26 01:31:28 | 10000.01 |
| 2021-03-26 01:31:59 | 10000.01 |
| 2021-03-26 01:32:29 | 10000.01 |
| 2021-03-26 01:33:00 | 10000.01 |
| 2021-03-26 01:33:31 | 10000.01 |
| 2021-03-26 01:34:01 | 10000.01 |
| 2021-03-26 01:34:32 | 10000.01 |
| 2021-03-26 01:35:03 | 10000.01 |
| 2021-03-26 01:35:33 | 10000.01 |
| 2021-03-26 01:36:04 | 10000.01 |
| 2021-03-26 01:36:35 | 10000.01 |
| 2021-03-26 01:37:05 | 10000.01 |
| 2021-03-26 01:37:36 | 10000.01 |
| 2021-03-26 01:38:07 | 10000.01 |
| 2021-03-26 01:38:37 | 10000.01 |
| 2021-03-26 01:39:08 | 10000.01 |
| 2021-03-26 01:39:39 | 10000.01 |
| 2021-03-26 01:40:09 | 10000.01 |
| 2021-03-26 01:40:40 | 10000.01 |
| 2021-03-26 01:41:11 | 10000.01 |
| 2021-03-26 01:41:41 | 10000.01 |
| 2021-03-26 01:42:12 | 10000.01 |
| 2021-03-26 01:42:43 | 10000.01 |
| 2021-03-26 01:43:14 | 10000.01 |
| 2021-03-26 01:43:44 | 10000.01 |
| 2021-03-26 01:44:15 | 10000.01 |
| 2021-03-26 01:44:46 | 10000.01 |
| 2021-03-26 01:45:16 | 10000.01 |
| 2021-03-26 01:45:47 | 10000.01 |
| 2021-03-26 01:46:18 | 10000.01 |
| 2021-03-26 01:46:48 | 10000.01 |
| 2021-03-26 01:47:19 | 10000.01 |
| 2021-03-26 01:47:50 | 10000.01 |
| 2021-03-26 01:48:20 | 10000.01 |
| 2021-03-26 01:48:51 | 10000.01 |
| 2021-03-26 01:49:22 | 10000.01 |
| 2021-03-26 01:49:52 | 10000.01 |
| 2021-03-26 01:50:23 | 10000.01 |
| 2021-03-26 01:50:54 | 10000.01 |
| 2021-03-26 01:51:24 | 10000.01 |
| 2021-03-26 01:51:55 | 10000.01 |
| 2021-03-26 01:52:26 | 10000.01 |
| 2021-03-26 01:52:56 | 10000.01 |
| 2021-03-26 01:53:27 | 10000.01 |
| 2021-03-26 01:53:58 | 10000.01 |
| 2021-03-26 01:54:29 | 10000.01 |
| 2021-03-26 01:54:59 | 10000.01 |
| 2021-03-26 01:55:30 | 10000.01 |
| 2021-03-26 01:56:01 | 10000.01 |
| 2021-03-26 01:56:31 | 10000.011 |
| 2021-03-26 01:57:02 | 10000.011 |
| 2021-03-26 01:57:33 | 10000.01 |
| 2021-03-26 01:58:03 | 10000.01 |
| 2021-03-26 01:58:34 | 10000.01 |
| 2021-03-26 01:59:05 | 10000.01 |
| 2021-03-26 01:59:35 | 10000.01 |
| 2021-03-26 02:00:06 | 10000.011 |
| 2021-03-26 02:00:37 | 10000.011 |
| 2021-03-26 02:01:07 | 10000.011 |
| 2021-03-26 02:01:38 | 10000.011 |
| 2021-03-26 02:02:09 | 10000.011 |
| 2021-03-26 02:02:39 | 10000.011 |
| 2021-03-26 02:03:10 | 10000.011 |
| 2021-03-26 02:03:41 | 10000.011 |
| 2021-03-26 02:04:12 | 10000.011 |
| 2021-03-26 02:04:42 | 10000.011 |
| 2021-03-26 02:05:13 | 10000.011 |
| 2021-03-26 02:05:44 | 10000.011 |
| 2021-03-26 02:06:14 | 10000.011 |
| 2021-03-26 02:06:45 | 10000.011 |
| 2021-03-26 02:07:16 | 10000.011 |
| 2021-03-26 02:07:46 | 10000.011 |
| 2021-03-26 02:08:17 | 10000.011 |
| 2021-03-26 02:08:48 | 10000.011 |
| 2021-03-26 02:09:18 | 10000.011 |
| 2021-03-26 02:09:49 | 10000.011 |
| 2021-03-26 02:10:20 | 10000.011 |
| 2021-03-26 02:10:50 | 10000.011 |
| 2021-03-26 02:11:21 | 10000.01 |
| 2021-03-26 02:11:52 | 10000.01 |
| 2021-03-26 02:12:22 | 10000.01 |
| 2021-03-26 02:12:53 | 10000.01 |
| 2021-03-26 02:13:24 | 10000.01 |
| 2021-03-26 02:13:55 | 10000.01 |
| 2021-03-26 02:14:25 | 10000.01 |
| 2021-03-26 02:14:56 | 10000.01 |
| 2021-03-26 02:15:27 | 10000.01 |
| 2021-03-26 02:15:57 | 10000.01 |
| 2021-03-26 02:16:28 | 10000.01 |
| 2021-03-26 02:16:59 | 10000.01 |
| 2021-03-26 02:17:29 | 10000.01 |
| 2021-03-26 02:18:00 | 10000.01 |
| 2021-03-26 02:18:31 | 10000.01 |
| 2021-03-26 02:19:01 | 10000.01 |
| 2021-03-26 02:19:32 | 10000.01 |
| 2021-03-26 02:20:03 | 10000.01 |
| 2021-03-26 02:20:33 | 10000.011 |
| 2021-03-26 02:21:04 | 10000.011 |
| 2021-03-26 02:21:35 | 10000.011 |
| 2021-03-26 02:22:05 | 10000.011 |
| 2021-03-26 02:22:36 | 10000.011 |
| 2021-03-26 02:23:07 | 10000.011 |
| 2021-03-26 02:23:38 | 10000.011 |
| 2021-03-26 02:24:08 | 10000.011 |
| 2021-03-26 02:24:39 | 10000.011 |
| 2021-03-26 02:25:10 | 10000.011 |
| 2021-03-26 02:25:40 | 10000.011 |
| 2021-03-26 02:26:11 | 10000.011 |
| 2021-03-26 02:26:42 | 10000.011 |
| 2021-03-26 02:27:12 | 10000.011 |
| 2021-03-26 02:27:43 | 10000.011 |
| 2021-03-26 02:28:14 | 10000.011 |
| 2021-03-26 02:28:44 | 10000.011 |
| 2021-03-26 02:29:15 | 10000.011 |
| 2021-03-26 02:29:46 | 10000.011 |
| 2021-03-26 02:30:16 | 10000.011 |
| 2021-03-26 02:30:47 | 10000.011 |
| 2021-03-26 02:31:18 | 10000.011 |
| 2021-03-26 02:31:48 | 10000.011 |
| 2021-03-26 02:32:19 | 10000.011 |
| 2021-03-26 02:32:50 | 10000.011 |
| 2021-03-26 02:33:21 | 10000.011 |
| 2021-03-26 02:33:51 | 10000.011 |
| 2021-03-26 02:34:22 | 10000.011 |
| 2021-03-26 02:34:53 | 10000.011 |
| 2021-03-26 02:35:23 | 10000.011 |
| 2021-03-26 02:35:54 | 10000.011 |
| 2021-03-26 02:36:25 | 10000.011 |
| 2021-03-26 02:36:55 | 10000.011 |
| 2021-03-26 02:37:26 | 10000.011 |
| 2021-03-26 02:37:57 | 10000.011 |
| 2021-03-26 02:38:27 | 10000.011 |
| 2021-03-26 02:38:58 | 10000.011 |
| 2021-03-26 02:39:29 | 10000.011 |
| 2021-03-26 02:39:59 | 10000.011 |
| 2021-03-26 02:40:30 | 10000.011 |
| 2021-03-26 02:41:01 | 10000.011 |
| 2021-03-26 02:41:31 | 10000.011 |
| 2021-03-26 02:42:02 | 10000.011 |
| 2021-03-26 02:42:33 | 10000.011 |
| 2021-03-26 02:43:03 | 10000.011 |
| 2021-03-26 02:43:34 | 10000.011 |
| 2021-03-26 02:44:05 | 10000.011 |
| 2021-03-26 02:44:36 | 10000.011 |
| 2021-03-26 02:45:06 | 10000.011 |
| 2021-03-26 02:45:37 | 10000.011 |
| 2021-03-26 02:46:08 | 10000.01 |
| 2021-03-26 02:46:38 | 10000.01 |
| 2021-03-26 02:47:09 | 10000.01 |
| 2021-03-26 02:47:40 | 10000.011 |
| 2021-03-26 02:48:10 | 10000.011 |
| 2021-03-26 02:48:41 | 10000.011 |
| 2021-03-26 02:49:12 | 10000.011 |
| 2021-03-26 02:49:42 | 10000.011 |
| 2021-03-26 02:50:13 | 10000.011 |
| 2021-03-26 02:50:44 | 10000.011 |
| 2021-03-26 02:51:14 | 10000.011 |
| 2021-03-26 02:51:45 | 10000.011 |
| 2021-03-26 02:52:16 | 10000.011 |
| 2021-03-26 02:52:46 | 10000.011 |
| 2021-03-26 02:53:17 | 10000.011 |
| 2021-03-26 02:53:48 | 10000.011 |
| 2021-03-26 02:54:19 | 10000.011 |
| 2021-03-26 02:54:49 | 10000.011 |
| 2021-03-26 02:55:20 | 10000.011 |
| 2021-03-26 02:55:51 | 10000.011 |
| 2021-03-26 02:56:21 | 10000.011 |
| 2021-03-26 02:56:52 | 10000.011 |
| 2021-03-26 02:57:23 | 10000.011 |
| 2021-03-26 02:57:53 | 10000.011 |
| 2021-03-26 02:58:24 | 10000.011 |
| 2021-03-26 02:58:55 | 10000.011 |
| 2021-03-26 02:59:25 | 10000.011 |
| 2021-03-26 02:59:56 | 10000.011 |
| 2021-03-26 03:00:27 | 10000.011 |
| 2021-03-26 03:00:57 | 10000.011 |
| 2021-03-26 03:01:28 | 10000.011 |
| 2021-03-26 03:01:59 | 10000.011 |
| 2021-03-26 03:02:29 | 10000.011 |
| 2021-03-26 03:03:00 | 10000.011 |
| 2021-03-26 03:03:31 | 10000.011 |
| 2021-03-26 03:04:02 | 10000.011 |
| 2021-03-26 03:04:32 | 10000.011 |
| 2021-03-26 03:05:03 | 10000.011 |
| 2021-03-26 03:05:34 | 10000.011 |
| 2021-03-26 03:06:04 | 10000.011 |
| 2021-03-26 03:06:35 | 10000.011 |
| 2021-03-26 03:07:06 | 10000.011 |
| 2021-03-26 03:07:36 | 10000.011 |
| 2021-03-26 03:08:07 | 10000.011 |
| 2021-03-26 03:08:38 | 10000.011 |
| 2021-03-26 03:09:08 | 10000.011 |
| 2021-03-26 03:09:39 | 10000.011 |
| 2021-03-26 03:10:10 | 10000.011 |
| 2021-03-26 03:10:40 | 10000.011 |
| 2021-03-26 03:11:11 | 10000.011 |
| 2021-03-26 03:11:42 | 10000.011 |
| 2021-03-26 03:12:12 | 10000.011 |
| 2021-03-26 03:12:43 | 10000.011 |
| 2021-03-26 03:13:14 | 10000.011 |
| 2021-03-26 03:13:45 | 10000.011 |
| 2021-03-26 03:14:15 | 10000.011 |
| 2021-03-26 03:14:46 | 10000.011 |
| 2021-03-26 03:15:17 | 10000.011 |
| 2021-03-26 03:15:47 | 10000.011 |
| 2021-03-26 03:16:18 | 10000.011 |
| 2021-03-26 03:16:49 | 10000.011 |
| 2021-03-26 03:17:19 | 10000.011 |
| 2021-03-26 03:17:50 | 10000.011 |
| 2021-03-26 03:18:21 | 10000.011 |
| 2021-03-26 03:18:51 | 10000.011 |
| 2021-03-26 03:19:22 | 10000.011 |
| 2021-03-26 03:19:53 | 10000.011 |
| 2021-03-26 03:20:23 | 10000.011 |
| 2021-03-26 03:20:54 | 10000.011 |
| 2021-03-26 03:21:25 | 10000.011 |
| 2021-03-26 03:21:55 | 10000.011 |
| 2021-03-26 03:22:26 | 10000.011 |
| 2021-03-26 03:22:57 | 10000.011 |
| 2021-03-26 03:23:28 | 10000.011 |
| 2021-03-26 03:23:58 | 10000.011 |
| 2021-03-26 03:24:29 | 10000.011 |
| 2021-03-26 03:25:00 | 10000.011 |
| 2021-03-26 03:25:30 | 10000.011 |
| 2021-03-26 03:26:01 | 10000.011 |
| 2021-03-26 03:26:32 | 10000.011 |
| 2021-03-26 03:27:02 | 10000.011 |
| 2021-03-26 03:27:33 | 10000.011 |
| 2021-03-26 03:28:04 | 10000.011 |
| 2021-03-26 03:28:34 | 10000.011 |
| 2021-03-26 03:29:05 | 10000.011 |
| 2021-03-26 03:29:36 | 10000.011 |
| 2021-03-26 03:30:06 | 10000.011 |
| 2021-03-26 03:30:37 | 10000.011 |
| 2021-03-26 03:31:08 | 10000.011 |
| 2021-03-26 03:31:38 | 10000.011 |
| 2021-03-26 03:32:09 | 10000.011 |
| 2021-03-26 03:32:40 | 10000.011 |
| 2021-03-26 03:33:11 | 10000.011 |
| 2021-03-26 03:33:41 | 10000.011 |
| 2021-03-26 03:34:12 | 10000.011 |
| 2021-03-26 03:34:43 | 10000.011 |
| 2021-03-26 03:35:13 | 10000.011 |
| 2021-03-26 03:35:44 | 10000.011 |
| 2021-03-26 03:36:15 | 10000.011 |
| 2021-03-26 03:36:45 | 10000.011 |
| 2021-03-26 03:37:16 | 10000.011 |
| 2021-03-26 03:37:47 | 10000.011 |
| 2021-03-26 03:38:17 | 10000.011 |
| 2021-03-26 03:38:48 | 10000.011 |
| 2021-03-26 03:39:19 | 10000.011 |
| 2021-03-26 03:39:49 | 10000.011 |
| 2021-03-26 03:40:20 | 10000.011 |
| 2021-03-26 03:40:51 | 10000.011 |
| 2021-03-26 03:41:22 | 10000.011 |
| 2021-03-26 03:41:52 | 10000.011 |
| 2021-03-26 03:42:23 | 10000.011 |
| 2021-03-26 03:42:54 | 10000.011 |
| 2021-03-26 03:43:24 | 10000.011 |
| 2021-03-26 03:43:55 | 10000.011 |
| 2021-03-26 03:44:26 | 10000.011 |
| 2021-03-26 03:44:56 | 10000.011 |
| 2021-03-26 03:45:27 | 10000.01 |
| 2021-03-26 03:45:58 | 10000.01 |
| 2021-03-26 03:46:28 | 10000.01 |
| 2021-03-26 03:46:59 | 10000.01 |
| 2021-03-26 03:47:30 | 10000.01 |
| 2021-03-26 03:48:00 | 10000.01 |
| 2021-03-26 03:48:31 | 10000.01 |
| 2021-03-26 03:49:02 | 10000.01 |
| 2021-03-26 03:49:32 | 10000.011 |
| 2021-03-26 03:50:03 | 10000.011 |
| 2021-03-26 03:50:34 | 10000.011 |
| 2021-03-26 03:51:05 | 10000.011 |
| 2021-03-26 03:51:35 | 10000.011 |
| 2021-03-26 03:52:06 | 10000.011 |
| 2021-03-26 03:52:37 | 10000.011 |
| 2021-03-26 03:53:07 | 10000.011 |
| 2021-03-26 03:53:38 | 10000.011 |
| 2021-03-26 03:54:09 | 10000.011 |
| 2021-03-26 03:54:39 | 10000.011 |
| 2021-03-26 03:55:10 | 10000.01 |
| 2021-03-26 03:55:41 | 10000.01 |
| 2021-03-26 03:56:11 | 10000.01 |
| 2021-03-26 03:56:42 | 10000.01 |
| 2021-03-26 03:57:13 | 10000.01 |
| 2021-03-26 03:57:43 | 10000.01 |
| 2021-03-26 03:58:14 | 10000.01 |
| 2021-03-26 03:58:45 | 10000.01 |
| 2021-03-26 03:59:16 | 10000.01 |
| 2021-03-26 03:59:46 | 10000.01 |
| 2021-03-26 04:00:17 | 10000.01 |
| 2021-03-26 04:00:48 | 10000.01 |
| 2021-03-26 04:01:18 | 10000.01 |
| 2021-03-26 04:01:49 | 10000.01 |
| 2021-03-26 04:02:20 | 10000.01 |
| 2021-03-26 04:02:50 | 10000.01 |
| 2021-03-26 04:03:21 | 10000.01 |
| 2021-03-26 04:03:52 | 10000.01 |
| 2021-03-26 04:04:22 | 10000.01 |
| 2021-03-26 04:04:53 | 10000.01 |
| 2021-03-26 04:05:24 | 10000.01 |
| 2021-03-26 04:05:54 | 10000.01 |
| 2021-03-26 04:06:25 | 10000.01 |
| 2021-03-26 04:06:56 | 10000.01 |
| 2021-03-26 04:07:26 | 10000.01 |
| 2021-03-26 04:07:57 | 10000.01 |
| 2021-03-26 04:08:28 | 10000.01 |
| 2021-03-26 04:08:59 | 10000.01 |
| 2021-03-26 04:09:29 | 10000.01 |
| 2021-03-26 04:10:00 | 10000.01 |
| 2021-03-26 04:10:31 | 10000.01 |
| 2021-03-26 04:11:01 | 10000.01 |
| 2021-03-26 04:11:32 | 10000.01 |
| 2021-03-26 04:12:03 | 10000.01 |
| 2021-03-26 04:12:33 | 10000.01 |
| 2021-03-26 04:13:04 | 10000.01 |
| 2021-03-26 04:13:35 | 10000.01 |
| 2021-03-26 04:14:05 | 10000.01 |
| 2021-03-26 04:14:36 | 10000.01 |
| 2021-03-26 04:15:07 | 10000.01 |
| 2021-03-26 04:15:37 | 10000.01 |
| 2021-03-26 04:16:08 | 10000.01 |
| 2021-03-26 04:16:39 | 10000.01 |
| 2021-03-26 04:17:09 | 10000.01 |
| 2021-03-26 04:17:40 | 10000.01 |
| 2021-03-26 04:18:11 | 10000.01 |
| 2021-03-26 04:18:42 | 10000.01 |
| 2021-03-26 04:19:12 | 10000.01 |
| 2021-03-26 04:19:43 | 10000.01 |
| 2021-03-26 04:20:14 | 10000.01 |
| 2021-03-26 04:20:44 | 10000.01 |
| 2021-03-26 04:21:15 | 10000.01 |
| 2021-03-26 04:21:46 | 10000.01 |
| 2021-03-26 04:22:16 | 10000.01 |
| 2021-03-26 04:22:47 | 10000.01 |
| 2021-03-26 04:23:18 | 10000.01 |
| 2021-03-26 04:23:48 | 10000.01 |
| 2021-03-26 04:24:19 | 10000.01 |
| 2021-03-26 04:24:50 | 10000.01 |
| 2021-03-26 04:25:20 | 10000.01 |
| 2021-03-26 04:25:51 | 10000.01 |
| 2021-03-26 04:26:22 | 10000.01 |
| 2021-03-26 04:26:52 | 10000.01 |
| 2021-03-26 04:27:23 | 10000.01 |
| 2021-03-26 04:27:54 | 10000.01 |
| 2021-03-26 04:28:24 | 10000.01 |
| 2021-03-26 04:28:55 | 10000.01 |
| 2021-03-26 04:29:26 | 10000.01 |
| 2021-03-26 04:29:57 | 10000.01 |
| 2021-03-26 04:30:27 | 10000.01 |
| 2021-03-26 04:30:58 | 10000.01 |
| 2021-03-26 04:31:29 | 10000.01 |
| 2021-03-26 04:31:59 | 10000.01 |
| 2021-03-26 04:32:30 | 10000.01 |
| 2021-03-26 04:33:01 | 10000.01 |
| 2021-03-26 04:33:31 | 10000.01 |
| 2021-03-26 04:34:02 | 10000.01 |
| 2021-03-26 04:34:33 | 10000.01 |
| 2021-03-26 04:35:03 | 10000.01 |
| 2021-03-26 04:35:34 | 10000.01 |
| 2021-03-26 04:36:05 | 10000.01 |
| 2021-03-26 04:36:35 | 10000.01 |
| 2021-03-26 04:37:06 | 10000.01 |
| 2021-03-26 04:37:37 | 10000.01 |
| 2021-03-26 04:38:07 | 10000.01 |
| 2021-03-26 04:38:38 | 10000.01 |
| 2021-03-26 04:39:09 | 10000.01 |
| 2021-03-26 04:39:39 | 10000.01 |
| 2021-03-26 04:40:10 | 10000.01 |
| 2021-03-26 04:40:41 | 10000.01 |
| 2021-03-26 04:41:12 | 10000.01 |
| 2021-03-26 04:41:42 | 10000.01 |
| 2021-03-26 04:42:13 | 10000.01 |
| 2021-03-26 04:42:44 | 10000.01 |
| 2021-03-26 04:43:14 | 10000.01 |
| 2021-03-26 04:43:45 | 10000.01 |
| 2021-03-26 04:44:16 | 10000.01 |
| 2021-03-26 04:44:46 | 10000.01 |
| 2021-03-26 04:45:17 | 10000.01 |
| 2021-03-26 04:45:48 | 10000.01 |
| 2021-03-26 04:46:18 | 10000.01 |
| 2021-03-26 04:46:49 | 10000.01 |
| 2021-03-26 04:47:20 | 10000.01 |
| 2021-03-26 04:47:50 | 10000.01 |
| 2021-03-26 04:48:21 | 10000.01 |
| 2021-03-26 04:48:52 | 10000.01 |
| 2021-03-26 04:49:22 | 10000.01 |
| 2021-03-26 04:49:53 | 10000.01 |
| 2021-03-26 04:50:24 | 10000.01 |
| 2021-03-26 04:50:54 | 10000.01 |
| 2021-03-26 04:51:25 | 10000.01 |
| 2021-03-26 04:51:56 | 10000.01 |
| 2021-03-26 04:52:27 | 10000.01 |
| 2021-03-26 04:52:57 | 10000.01 |
| 2021-03-26 04:53:28 | 10000.01 |
| 2021-03-26 04:53:59 | 10000.01 |
| 2021-03-26 04:54:29 | 10000.01 |
| 2021-03-26 04:55:00 | 10000.01 |
| 2021-03-26 04:55:31 | 10000.01 |
| 2021-03-26 04:56:01 | 10000.01 |
| 2021-03-26 04:56:32 | 10000.01 |
| 2021-03-26 04:57:03 | 10000.01 |
| 2021-03-26 04:57:33 | 10000.01 |
| 2021-03-26 04:58:04 | 10000.01 |
| 2021-03-26 04:58:35 | 10000.01 |
| 2021-03-26 04:59:05 | 10000.01 |
| 2021-03-26 04:59:36 | 10000.01 |
| 2021-03-26 05:00:07 | 10000.01 |
| 2021-03-26 05:00:37 | 10000.01 |
| 2021-03-26 05:01:08 | 10000.01 |
| 2021-03-26 05:01:39 | 10000.01 |
| 2021-03-26 05:02:10 | 10000.01 |
| 2021-03-26 05:02:40 | 10000.01 |
| 2021-03-26 05:03:11 | 10000.01 |
| 2021-03-26 05:03:42 | 10000.01 |
| 2021-03-26 05:04:12 | 10000.01 |
| 2021-03-26 05:04:43 | 10000.01 |
| 2021-03-26 05:05:14 | 10000.01 |
| 2021-03-26 05:05:44 | 10000.01 |
| 2021-03-26 05:06:15 | 10000.01 |
| 2021-03-26 05:06:46 | 10000.01 |
| 2021-03-26 05:07:16 | 10000.01 |
| 2021-03-26 05:07:47 | 10000.01 |
| 2021-03-26 05:08:18 | 10000.01 |
| 2021-03-26 05:08:48 | 10000.01 |
| 2021-03-26 05:09:19 | 10000.01 |
| 2021-03-26 05:09:50 | 10000.01 |
| 2021-03-26 05:10:20 | 10000.01 |
| 2021-03-26 05:10:51 | 10000.01 |
| 2021-03-26 05:11:22 | 10000.01 |
| 2021-03-26 05:11:53 | 10000.01 |
| 2021-03-26 05:12:23 | 10000.01 |
| 2021-03-26 05:12:54 | 10000.01 |
| 2021-03-26 05:13:25 | 10000.01 |
| 2021-03-26 05:13:55 | 10000.01 |
| 2021-03-26 05:14:26 | 10000.01 |
| 2021-03-26 05:14:57 | 10000.01 |
| 2021-03-26 05:15:27 | 10000.01 |
| 2021-03-26 05:15:58 | 10000.01 |
| 2021-03-26 05:16:29 | 10000.01 |
| 2021-03-26 05:16:59 | 10000.01 |
| 2021-03-26 05:17:30 | 10000.01 |
| 2021-03-26 05:18:01 | 10000.01 |
| 2021-03-26 05:18:31 | 10000.01 |
| 2021-03-26 05:19:02 | 10000.01 |
| 2021-03-26 05:19:33 | 10000.01 |
| 2021-03-26 05:20:04 | 10000.01 |
| 2021-03-26 05:20:34 | 10000.01 |
| 2021-03-26 05:21:05 | 10000.01 |
| 2021-03-26 05:21:36 | 10000.01 |
| 2021-03-26 05:22:06 | 10000.01 |
| 2021-03-26 05:22:37 | 10000.01 |
| 2021-03-26 05:23:08 | 10000.01 |
| 2021-03-26 05:23:38 | 10000.01 |
| 2021-03-26 05:24:09 | 10000.01 |
| 2021-03-26 05:24:40 | 10000.01 |
| 2021-03-26 05:25:10 | 10000.01 |
| 2021-03-26 05:25:41 | 10000.01 |
| 2021-03-26 05:26:12 | 10000.01 |
| 2021-03-26 05:26:42 | 10000.01 |
| 2021-03-26 05:27:13 | 10000.01 |
| 2021-03-26 05:27:44 | 10000.01 |
| 2021-03-26 05:28:15 | 10000.01 |
| 2021-03-26 05:28:45 | 10000.01 |
| 2021-03-26 05:29:16 | 10000.01 |
| 2021-03-26 05:29:47 | 10000.01 |
| 2021-03-26 05:30:17 | 10000.01 |
| 2021-03-26 05:30:48 | 10000.01 |
| 2021-03-26 05:31:19 | 10000.01 |
| 2021-03-26 05:31:49 | 10000.01 |
| 2021-03-26 05:32:20 | 10000.01 |
| 2021-03-26 05:32:51 | 10000.01 |
| 2021-03-26 05:33:21 | 10000.01 |
| 2021-03-26 05:33:52 | 10000.01 |
| 2021-03-26 05:34:23 | 10000.01 |
| 2021-03-26 05:34:53 | 10000.01 |
| 2021-03-26 05:35:24 | 10000.01 |
| 2021-03-26 05:35:55 | 10000.01 |
| 2021-03-26 05:36:26 | 10000.01 |
| 2021-03-26 05:36:56 | 10000.01 |
| 2021-03-26 05:37:27 | 10000.01 |
| 2021-03-26 05:37:58 | 10000.01 |
| 2021-03-26 05:38:28 | 10000.01 |
| 2021-03-26 05:38:59 | 10000.01 |
| 2021-03-26 05:39:30 | 10000.01 |
| 2021-03-26 05:40:00 | 10000.01 |
| 2021-03-26 05:40:31 | 10000.01 |
| 2021-03-26 05:41:02 | 10000.01 |
| 2021-03-26 05:41:32 | 10000.01 |
| 2021-03-26 05:42:03 | 10000.01 |
| 2021-03-26 05:42:34 | 10000.01 |
| 2021-03-26 05:43:04 | 10000.01 |
| 2021-03-26 05:43:35 | 10000.01 |
| 2021-03-26 05:44:06 | 10000.01 |
| 2021-03-26 05:44:36 | 10000.01 |
| 2021-03-26 05:45:07 | 10000.01 |
| 2021-03-26 05:45:38 | 10000.01 |
| 2021-03-26 05:46:09 | 10000.01 |
| 2021-03-26 05:46:39 | 10000.01 |
| 2021-03-26 05:47:10 | 10000.01 |
| 2021-03-26 05:47:41 | 10000.01 |
| 2021-03-26 05:48:11 | 10000.01 |
| 2021-03-26 05:48:42 | 10000.01 |
| 2021-03-26 05:49:13 | 10000.01 |
| 2021-03-26 05:49:43 | 10000.01 |
| 2021-03-26 05:50:14 | 10000.01 |
| 2021-03-26 05:50:45 | 10000.01 |
| 2021-03-26 05:51:15 | 10000.01 |
| 2021-03-26 05:51:46 | 10000.01 |
| 2021-03-26 05:52:17 | 10000.01 |
| 2021-03-26 05:52:47 | 10000.01 |
| 2021-03-26 05:53:18 | 10000.01 |
| 2021-03-26 05:53:49 | 10000.01 |
| 2021-03-26 05:54:20 | 10000.01 |
| 2021-03-26 05:54:50 | 10000.01 |
| 2021-03-26 05:55:21 | 10000.01 |
| 2021-03-26 05:55:52 | 10000.01 |
| 2021-03-26 05:56:22 | 10000.01 |
| 2021-03-26 05:56:53 | 10000.01 |
| 2021-03-26 05:57:24 | 10000.01 |
| 2021-03-26 05:57:54 | 10000.01 |
| 2021-03-26 05:58:25 | 10000.01 |
| 2021-03-26 05:58:56 | 10000.01 |
| 2021-03-26 05:59:26 | 10000.01 |
| 2021-03-26 05:59:57 | 10000.01 |
| 2021-03-26 06:00:28 | 10000.01 |
| 2021-03-26 06:00:58 | 10000.01 |
| 2021-03-26 06:01:29 | 10000.01 |
| 2021-03-26 06:02:00 | 10000.01 |
| 2021-03-26 06:02:30 | 10000.01 |
| 2021-03-26 06:03:01 | 10000.01 |
| 2021-03-26 06:03:32 | 10000.01 |
| 2021-03-26 06:04:03 | 10000.01 |
| 2021-03-26 06:04:33 | 10000.01 |
| 2021-03-26 06:05:04 | 10000.01 |
| 2021-03-26 06:05:35 | 10000.01 |
| 2021-03-26 06:06:05 | 10000.01 |
| 2021-03-26 06:06:36 | 10000.01 |
| 2021-03-26 06:07:07 | 10000.01 |
| 2021-03-26 06:07:37 | 10000.01 |
| 2021-03-26 06:08:08 | 10000.01 |
| 2021-03-26 06:08:39 | 10000.01 |
| 2021-03-26 06:09:09 | 10000.01 |
| 2021-03-26 06:09:40 | 10000.01 |
| 2021-03-26 06:10:11 | 10000.01 |
| 2021-03-26 06:10:41 | 10000.01 |
| 2021-03-26 06:11:12 | 10000.01 |
| 2021-03-26 06:11:43 | 10000.01 |
| 2021-03-26 06:12:13 | 10000.01 |
| 2021-03-26 06:12:44 | 10000.01 |
| 2021-03-26 06:13:15 | 10000.01 |
| 2021-03-26 06:13:45 | 10000.01 |
| 2021-03-26 06:14:16 | 10000.01 |
| 2021-03-26 06:14:47 | 10000.01 |
| 2021-03-26 06:15:18 | 10000.01 |
| 2021-03-26 06:15:48 | 10000.01 |
| 2021-03-26 06:16:19 | 10000.01 |
| 2021-03-26 06:16:50 | 10000.01 |
| 2021-03-26 06:17:20 | 10000.01 |
| 2021-03-26 06:17:51 | 10000.01 |
| 2021-03-26 06:18:22 | 10000.01 |
| 2021-03-26 06:18:52 | 10000.01 |
| 2021-03-26 06:19:23 | 10000.01 |
| 2021-03-26 06:19:54 | 10000.01 |
| 2021-03-26 06:20:24 | 10000.01 |
| 2021-03-26 06:20:55 | 10000.01 |
| 2021-03-26 06:21:26 | 10000.01 |
| 2021-03-26 06:21:56 | 10000.01 |
| 2021-03-26 06:22:27 | 10000.01 |
| 2021-03-26 06:22:58 | 10000.01 |
| 2021-03-26 06:23:28 | 10000.01 |
| 2021-03-26 06:23:59 | 10000.01 |
| 2021-03-26 06:24:30 | 10000.01 |
| 2021-03-26 06:25:00 | 10000.01 |
| 2021-03-26 06:25:31 | 10000.01 |
| 2021-03-26 06:26:02 | 10000.01 |
| 2021-03-26 06:26:32 | 10000.01 |
| 2021-03-26 06:27:03 | 10000.01 |
| 2021-03-26 06:27:34 | 10000.01 |
| 2021-03-26 06:28:05 | 10000.01 |
| 2021-03-26 06:28:35 | 10000.01 |
| 2021-03-26 06:29:06 | 10000.01 |
| 2021-03-26 06:29:37 | 10000.01 |
| 2021-03-26 06:30:07 | 10000.01 |
| 2021-03-26 06:30:38 | 10000.01 |
| 2021-03-26 06:31:09 | 10000.01 |
| 2021-03-26 06:31:39 | 10000.01 |
| 2021-03-26 06:32:10 | 10000.01 |
| 2021-03-26 06:32:41 | 10000.01 |
| 2021-03-26 06:33:11 | 10000.01 |
| 2021-03-26 06:33:42 | 10000.01 |
| 2021-03-26 06:34:13 | 10000.01 |
| 2021-03-26 06:34:43 | 10000.01 |
| 2021-03-26 06:35:14 | 10000.01 |
| 2021-03-26 06:35:45 | 10000.01 |
| 2021-03-26 06:36:15 | 10000.01 |
| 2021-03-26 06:36:46 | 10000.01 |
| 2021-03-26 06:37:17 | 10000.01 |
| 2021-03-26 06:37:47 | 10000.01 |
| 2021-03-26 06:38:18 | 10000.01 |
| 2021-03-26 06:38:49 | 10000.01 |
| 2021-03-26 06:39:19 | 10000.01 |
| 2021-03-26 06:39:50 | 10000.01 |
| 2021-03-26 06:40:21 | 10000.01 |
| 2021-03-26 06:40:52 | 10000.01 |
| 2021-03-26 06:41:22 | 10000.01 |
| 2021-03-26 06:41:53 | 10000.01 |
| 2021-03-26 06:42:24 | 10000.01 |
| 2021-03-26 06:42:54 | 10000.01 |
| 2021-03-26 06:43:25 | 10000.01 |
| 2021-03-26 06:43:56 | 10000.01 |
| 2021-03-26 06:44:26 | 10000.01 |
| 2021-03-26 06:44:57 | 10000.01 |
| 2021-03-26 06:45:28 | 10000.01 |
| 2021-03-26 06:45:58 | 10000.01 |
| 2021-03-26 06:46:29 | 10000.01 |
| 2021-03-26 06:47:00 | 10000.01 |
| 2021-03-26 06:47:30 | 10000.01 |
| 2021-03-26 06:48:01 | 10000.01 |
| 2021-03-26 06:48:32 | 10000.01 |
| 2021-03-26 06:49:02 | 10000.01 |
| 2021-03-26 06:49:33 | 10000.01 |
| 2021-03-26 06:50:04 | 10000.01 |
| 2021-03-26 06:50:34 | 10000.01 |
| 2021-03-26 06:51:05 | 10000.01 |
| 2021-03-26 06:51:36 | 10000.01 |
| 2021-03-26 06:52:06 | 10000.01 |
| 2021-03-26 06:52:37 | 10000.01 |
| 2021-03-26 06:53:08 | 10000.01 |
| 2021-03-26 06:53:39 | 10000.01 |
| 2021-03-26 06:54:09 | 10000.01 |
| 2021-03-26 06:54:40 | 10000.01 |
| 2021-03-26 06:55:11 | 10000.01 |
| 2021-03-26 06:55:41 | 10000.01 |
| 2021-03-26 06:56:12 | 10000.01 |
| 2021-03-26 06:56:43 | 10000.01 |
| 2021-03-26 06:57:13 | 10000.01 |
| 2021-03-26 06:57:44 | 10000.01 |
| 2021-03-26 06:58:15 | 10000.01 |
| 2021-03-26 06:58:45 | 10000.01 |
| 2021-03-26 06:59:16 | 10000.01 |
| 2021-03-26 06:59:47 | 10000.01 |
| 2021-03-26 07:00:17 | 10000.01 |
| 2021-03-26 07:00:48 | 10000.01 |
| 2021-03-26 07:01:19 | 10000.01 |
| 2021-03-26 07:01:49 | 10000.01 |
| 2021-03-26 07:02:20 | 10000.01 |
| 2021-03-26 07:02:51 | 10000.01 |
| 2021-03-26 07:03:21 | 10000.01 |
| 2021-03-26 07:03:52 | 10000.01 |
| 2021-03-26 07:04:23 | 10000.01 |
| 2021-03-26 07:04:54 | 10000.01 |
| 2021-03-26 07:05:24 | 10000.01 |
| 2021-03-26 07:05:55 | 10000.01 |
| 2021-03-26 07:06:26 | 10000.01 |
| 2021-03-26 07:06:56 | 10000.01 |
| 2021-03-26 07:07:27 | 10000.01 |
| 2021-03-26 07:07:58 | 10000.01 |
| 2021-03-26 07:08:28 | 10000.01 |
| 2021-03-26 07:08:59 | 10000.01 |
| 2021-03-26 07:09:30 | 10000.01 |
| 2021-03-26 07:10:00 | 10000.01 |
| 2021-03-26 07:10:31 | 10000.01 |
| 2021-03-26 07:11:02 | 10000.01 |
| 2021-03-26 07:11:32 | 10000.01 |
| 2021-03-26 07:12:03 | 10000.01 |
| 2021-03-26 07:12:34 | 10000.01 |
| 2021-03-26 07:13:04 | 10000.01 |
| 2021-03-26 07:13:35 | 10000.01 |
| 2021-03-26 07:14:06 | 10000.01 |
| 2021-03-26 07:14:36 | 10000.01 |
| 2021-03-26 07:15:07 | 10000.01 |
| 2021-03-26 07:15:38 | 10000.01 |
| 2021-03-26 07:16:08 | 10000.01 |
| 2021-03-26 07:16:39 | 10000.01 |
| 2021-03-26 07:17:10 | 10000.01 |
| 2021-03-26 07:17:41 | 10000.01 |
| 2021-03-26 07:18:11 | 10000.01 |
| 2021-03-26 07:18:42 | 10000.01 |
| 2021-03-26 07:19:13 | 10000.01 |
| 2021-03-26 07:19:43 | 10000.01 |
| 2021-03-26 07:20:14 | 10000.01 |
| 2021-03-26 07:20:45 | 10000.01 |
| 2021-03-26 07:21:15 | 10000.01 |
| 2021-03-26 07:21:46 | 10000.01 |
| 2021-03-26 07:22:17 | 10000.01 |
| 2021-03-26 07:22:47 | 10000.01 |
| 2021-03-26 07:23:18 | 10000.01 |
| 2021-03-26 07:23:49 | 10000.01 |
| 2021-03-26 07:24:19 | 10000.01 |
| 2021-03-26 07:24:50 | 10000.01 |
| 2021-03-26 07:25:21 | 10000.01 |
| 2021-03-26 07:25:51 | 10000.01 |
| 2021-03-26 07:26:22 | 10000.01 |
| 2021-03-26 07:26:53 | 10000.01 |
| 2021-03-26 07:27:23 | 10000.01 |
| 2021-03-26 07:27:54 | 10000.01 |
| 2021-03-26 07:28:25 | 10000.01 |
| 2021-03-26 07:28:55 | 10000.01 |
| 2021-03-26 07:29:26 | 10000.01 |
| 2021-03-26 07:29:57 | 10000.01 |
| 2021-03-26 07:30:27 | 10000.01 |
| 2021-03-26 07:30:58 | 10000.01 |
| 2021-03-26 07:31:29 | 10000.01 |
| 2021-03-26 07:32:00 | 10000.01 |
| 2021-03-26 07:32:30 | 10000.01 |
| 2021-03-26 07:33:01 | 10000.01 |
| 2021-03-26 07:33:32 | 10000.01 |
| 2021-03-26 07:34:02 | 10000.01 |
| 2021-03-26 07:34:33 | 10000.01 |
| 2021-03-26 07:35:04 | 10000.01 |
| 2021-03-26 07:35:34 | 10000.01 |
| 2021-03-26 07:36:05 | 10000.01 |
| 2021-03-26 07:36:36 | 10000.01 |
| 2021-03-26 07:37:06 | 10000.01 |
| 2021-03-26 07:37:37 | 10000.01 |
| 2021-03-26 07:38:08 | 10000.01 |
| 2021-03-26 07:38:38 | 10000.01 |
| 2021-03-26 07:39:09 | 10000.01 |
| 2021-03-26 07:39:40 | 10000.01 |
| 2021-03-26 07:40:10 | 10000.01 |
| 2021-03-26 07:40:41 | 10000.01 |
| 2021-03-26 07:41:12 | 10000.01 |
| 2021-03-26 07:41:42 | 10000.01 |
| 2021-03-26 07:42:13 | 10000.01 |
| 2021-03-26 07:42:44 | 10000.01 |
| 2021-03-26 07:43:15 | 10000.01 |
| 2021-03-26 07:43:45 | 10000.01 |
| 2021-03-26 07:44:16 | 10000.01 |
| 2021-03-26 07:44:47 | 10000.01 |
| 2021-03-26 07:45:17 | 10000.01 |
| 2021-03-26 07:45:48 | 10000.01 |
| 2021-03-26 07:46:19 | 10000.01 |
| 2021-03-26 07:46:49 | 10000.01 |
| 2021-03-26 07:47:20 | 10000.01 |
| 2021-03-26 07:47:51 | 10000.01 |
| 2021-03-26 07:48:21 | 10000.01 |
| 2021-03-26 07:48:52 | 10000.01 |
| 2021-03-26 07:49:23 | 10000.011 |
| 2021-03-26 07:49:53 | 10000.011 |
| 2021-03-26 07:50:24 | 10000.011 |
| 2021-03-26 07:50:55 | 10000.011 |
| 2021-03-26 07:51:25 | 10000.01 |
| 2021-03-26 07:51:56 | 10000.01 |
| 2021-03-26 07:52:27 | 10000.01 |
| 2021-03-26 07:52:58 | 10000.01 |
| 2021-03-26 07:53:28 | 10000.01 |
| 2021-03-26 07:53:59 | 10000.01 |
| 2021-03-26 07:54:30 | 10000.01 |
| 2021-03-26 07:55:00 | 10000.01 |
| 2021-03-26 07:55:31 | 10000.01 |
| 2021-03-26 07:56:02 | 10000.01 |
| 2021-03-26 07:56:32 | 10000.01 |
| 2021-03-26 07:57:03 | 10000.01 |
| 2021-03-26 07:57:34 | 10000.01 |
| 2021-03-26 07:58:04 | 10000.01 |
| 2021-03-26 07:58:35 | 10000.01 |
| 2021-03-26 07:59:06 | 10000.01 |
| 2021-03-26 07:59:36 | 10000.01 |
| 2021-03-26 08:00:07 | 10000.01 |
| 2021-03-26 08:00:38 | 10000.01 |
| 2021-03-26 08:01:08 | 10000.01 |
| 2021-03-26 08:01:39 | 10000.01 |
| 2021-03-26 08:02:10 | 10000.01 |
| 2021-03-26 08:02:40 | 10000.01 |
| 2021-03-26 08:03:11 | 10000.01 |
| 2021-03-26 08:03:42 | 10000.01 |
| 2021-03-26 08:04:12 | 10000.01 |
| 2021-03-26 08:04:43 | 10000.01 |
| 2021-03-26 08:05:14 | 10000.01 |
| 2021-03-26 08:05:45 | 10000.01 |
| 2021-03-26 08:06:15 | 10000.01 |
| 2021-03-26 08:06:46 | 10000.01 |
| 2021-03-26 08:07:17 | 10000.01 |
| 2021-03-26 08:07:47 | 10000.01 |
| 2021-03-26 08:08:18 | 10000.01 |
| 2021-03-26 08:08:49 | 10000.01 |